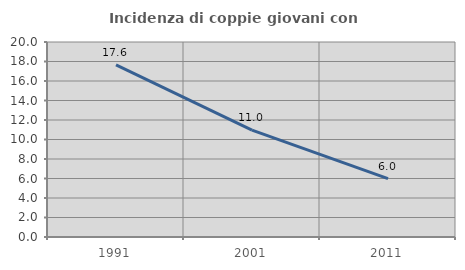
| Category | Incidenza di coppie giovani con figli |
|---|---|
| 1991.0 | 17.647 |
| 2001.0 | 10.954 |
| 2011.0 | 5.991 |